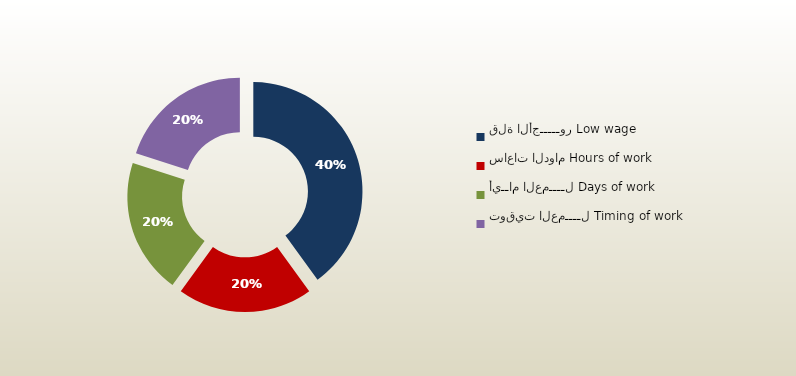
| Category | المجموع
Total |
|---|---|
| قلة الأجـــــور Low wage | 114 |
| ساعات الدوام Hours of work | 57 |
| أيــام العمــــل Days of work | 57 |
| توقيت العمــــل Timing of work | 57 |